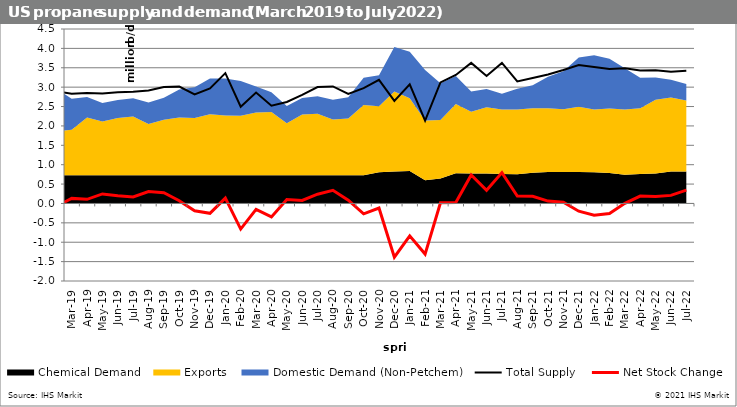
| Category | Total Supply  | Net Stock Change  |
|---|---|---|
| 2016-01-15 | 2.367 | -0.554 |
| 2016-02-15 | 2.439 | -0.44 |
| 2016-03-15 | 2.413 | 0.11 |
| 2016-04-15 | 2.392 | 0.254 |
| 2016-05-15 | 2.404 | 0.119 |
| 2016-06-15 | 2.36 | 0.258 |
| 2016-07-15 | 2.379 | 0.163 |
| 2016-08-15 | 2.388 | 0.091 |
| 2016-09-15 | 2.381 | 0.179 |
| 2016-10-15 | 2.373 | -0.275 |
| 2016-11-15 | 2.466 | -0.24 |
| 2016-12-15 | 2.417 | -0.743 |
| 2017-01-15 | 2.478 | -0.732 |
| 2017-02-15 | 2.431 | -0.477 |
| 2017-03-15 | 2.484 | -0.428 |
| 2017-04-15 | 2.444 | -0.122 |
| 2017-05-15 | 2.502 | 0.099 |
| 2017-06-15 | 2.492 | 0.239 |
| 2017-07-15 | 2.497 | 0.192 |
| 2017-08-15 | 2.469 | 0.234 |
| 2017-09-15 | 2.412 | -0.075 |
| 2017-10-15 | 2.61 | -0.231 |
| 2017-11-15 | 2.632 | -0.185 |
| 2017-12-15 | 2.659 | -0.353 |
| 2018-01-15 | 2.727 | -0.314 |
| 2018-02-15 | 2.719 | -0.081 |
| 2018-03-15 | 2.69 | 0.001 |
| 2018-04-15 | 2.685 | 0.125 |
| 2018-05-15 | 2.68 | 0.179 |
| 2018-06-15 | 2.705 | 0.27 |
| 2018-07-15 | 2.756 | 0.118 |
| 2018-08-15 | 2.82 | 0.171 |
| 2018-09-15 | 2.846 | 0.418 |
| 2018-10-15 | 2.868 | 0.115 |
| 2018-11-15 | 2.962 | -0.017 |
| 2018-12-15 | 2.993 | -0.245 |
| 2019-01-15 | 2.966 | -0.203 |
| 2019-02-15 | 2.888 | -0.073 |
| 2019-03-15 | 2.83 | 0.131 |
| 2019-04-15 | 2.85 | 0.106 |
| 2019-05-15 | 2.837 | 0.246 |
| 2019-06-15 | 2.866 | 0.2 |
| 2019-07-15 | 2.881 | 0.17 |
| 2019-08-15 | 2.913 | 0.309 |
| 2019-09-15 | 3.006 | 0.277 |
| 2019-10-15 | 3.014 | 0.071 |
| 2019-11-15 | 2.811 | -0.189 |
| 2019-12-15 | 2.969 | -0.253 |
| 2020-01-15 | 3.361 | 0.139 |
| 2020-02-15 | 2.495 | -0.661 |
| 2020-03-15 | 2.863 | -0.154 |
| 2020-04-15 | 2.52 | -0.347 |
| 2020-05-15 | 2.618 | 0.104 |
| 2020-06-15 | 2.8 | 0.077 |
| 2020-07-15 | 3.004 | 0.238 |
| 2020-08-15 | 3.018 | 0.34 |
| 2020-09-15 | 2.824 | 0.084 |
| 2020-10-15 | 2.974 | -0.267 |
| 2020-11-15 | 3.188 | -0.118 |
| 2020-12-15 | 2.647 | -1.387 |
| 2021-01-15 | 3.075 | -0.835 |
| 2021-02-15 | 2.139 | -1.306 |
| 2021-03-15 | 3.122 | 0.019 |
| 2021-04-15 | 3.313 | 0.022 |
| 2021-05-15 | 3.626 | 0.735 |
| 2021-06-15 | 3.289 | 0.338 |
| 2021-07-15 | 3.624 | 0.795 |
| 2021-08-15 | 3.147 | 0.189 |
| 2021-09-15 | 3.236 | 0.186 |
| 2021-10-15 | 3.326 | 0.061 |
| 2021-11-15 | 3.442 | 0.033 |
| 2021-12-15 | 3.569 | -0.199 |
| 2022-01-15 | 3.522 | -0.304 |
| 2022-02-15 | 3.47 | -0.26 |
| 2022-03-15 | 3.489 | 0.003 |
| 2022-04-15 | 3.432 | 0.191 |
| 2022-05-15 | 3.435 | 0.182 |
| 2022-06-15 | 3.4 | 0.209 |
| 2022-07-15 | 3.425 | 0.344 |